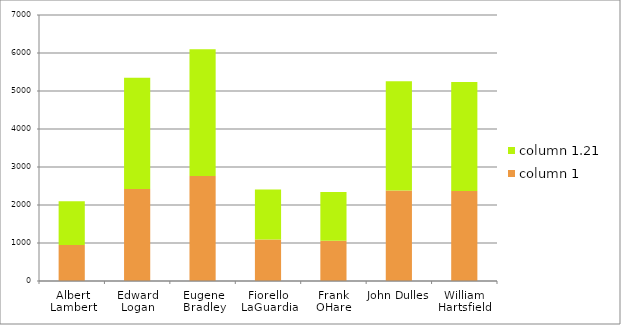
| Category | column 1 | column 1.21 |
|---|---|---|
| Albert Lambert | 950 | 1149.5 |
| Edward Logan | 2420 | 2928.2 |
| Eugene Bradley | 2760 | 3339.6 |
| Fiorello LaGuardia | 1090 | 1318.9 |
| Frank OHare | 1060 | 1282.6 |
| John Dulles | 2380 | 2879.8 |
| William Hartsfield | 2370 | 2867.7 |